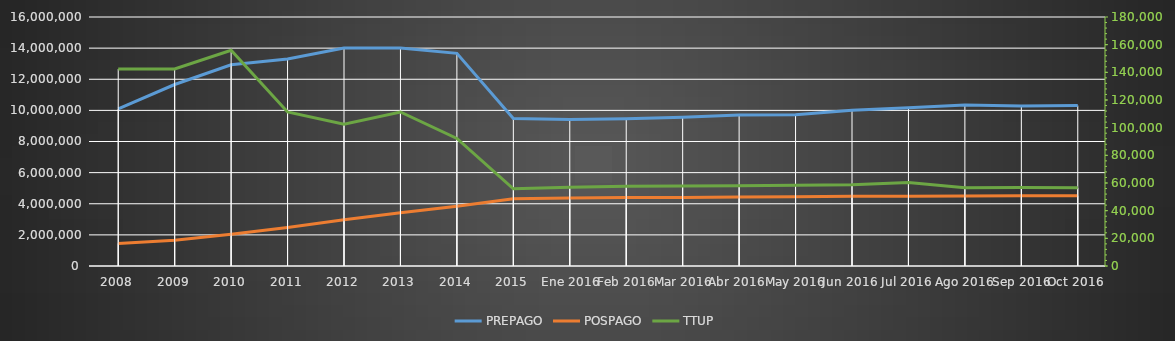
| Category | PREPAGO | POSPAGO |
|---|---|---|
| 2008 | 10097768 | 1452088 |
| 2009 | 11662294 | 1649838 |
| 2010 | 12929040 | 2033814 |
| 2011 | 13295834 | 2467378 |
| 2012 | 14008104 | 2976194 |
| 2013 | 14005126 | 3425277 |
| 2014 | 13666071 | 3846271 |
| 2015 | 9476240 | 4326937 |
| Ene 2016 | 9414069 | 4363041 |
| Feb 2016 | 9461143 | 4403744 |
| Mar 2016 | 9559280 | 4405629 |
| Abr 2016 | 9695379 | 4438022 |
| May 2016 | 9714309 | 4454361 |
| Jun 2016 | 10003869 | 4477370 |
| Jul 2016 | 10174392 | 4486818 |
| Ago 2016 | 10348607 | 4503084 |
| Sep 2016 | 10280609 | 4507228 |
| Oct 2016 | 10308394 | 4509498 |